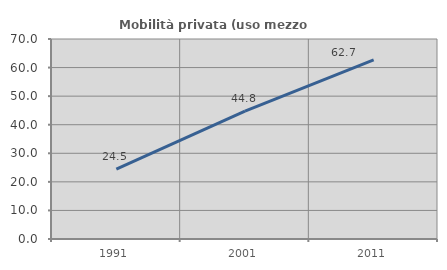
| Category | Mobilità privata (uso mezzo privato) |
|---|---|
| 1991.0 | 24.457 |
| 2001.0 | 44.755 |
| 2011.0 | 62.676 |